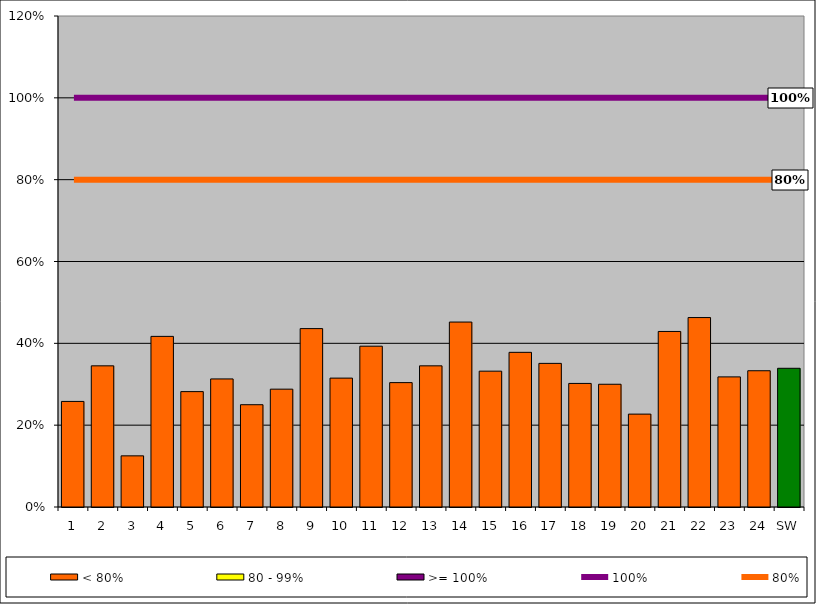
| Category | < 80% | 80 - 99% | >= 100% |
|---|---|---|---|
| 1 | 0.258 | 0 | 0 |
| 2 | 0.345 | 0 | 0 |
| 3 | 0.125 | 0 | 0 |
| 4 | 0.417 | 0 | 0 |
| 5 | 0.282 | 0 | 0 |
| 6 | 0.313 | 0 | 0 |
| 7 | 0.25 | 0 | 0 |
| 8 | 0.288 | 0 | 0 |
| 9 | 0.436 | 0 | 0 |
| 10 | 0.315 | 0 | 0 |
| 11 | 0.393 | 0 | 0 |
| 12 | 0.304 | 0 | 0 |
| 13 | 0.345 | 0 | 0 |
| 14 | 0.452 | 0 | 0 |
| 15 | 0.332 | 0 | 0 |
| 16 | 0.378 | 0 | 0 |
| 17 | 0.351 | 0 | 0 |
| 18 | 0.302 | 0 | 0 |
| 19 | 0.3 | 0 | 0 |
| 20 | 0.227 | 0 | 0 |
| 21 | 0.429 | 0 | 0 |
| 22 | 0.463 | 0 | 0 |
| 23 | 0.318 | 0 | 0 |
| 24 | 0.333 | 0 | 0 |
| SW | 0.339 | 0 | 0 |